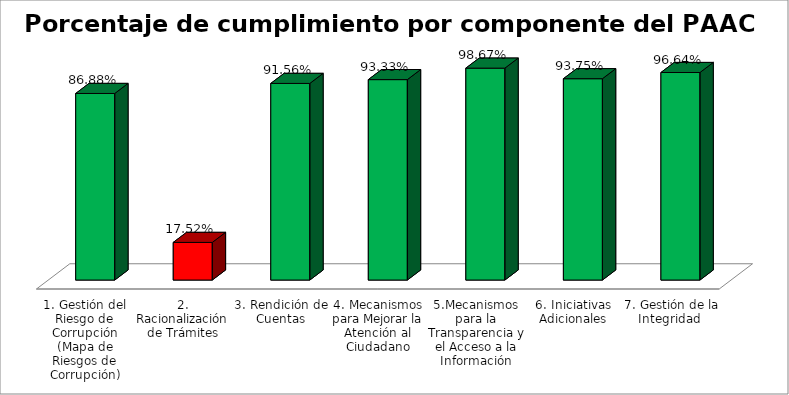
| Category | Series 0 |
|---|---|
| 1. Gestión del Riesgo de Corrupción (Mapa de Riesgos de Corrupción) | 0.869 |
| 2. Racionalización de Trámites | 0.175 |
| 3. Rendición de Cuentas | 0.916 |
| 4. Mecanismos para Mejorar la Atención al Ciudadano | 0.933 |
| 5.Mecanismos para la Transparencia y el Acceso a la Información | 0.987 |
| 6. Iniciativas Adicionales | 0.938 |
| 7. Gestión de la Integridad  | 0.966 |